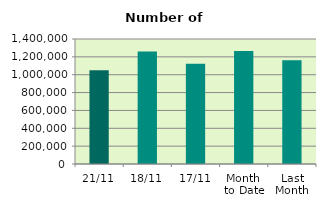
| Category | Series 0 |
|---|---|
| 21/11 | 1049438 |
| 18/11 | 1260766 |
| 17/11 | 1122084 |
| Month 
to Date | 1265507.067 |
| Last
Month | 1161301.714 |